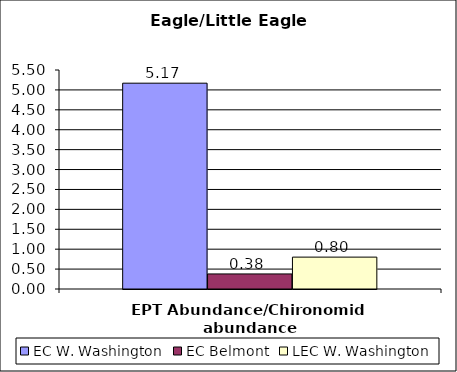
| Category | EC W. Washington | EC Belmont | LEC W. Washington |
|---|---|---|---|
| EPT Abundance/Chironomid abundance | 5.169 | 0.379 | 0.801 |